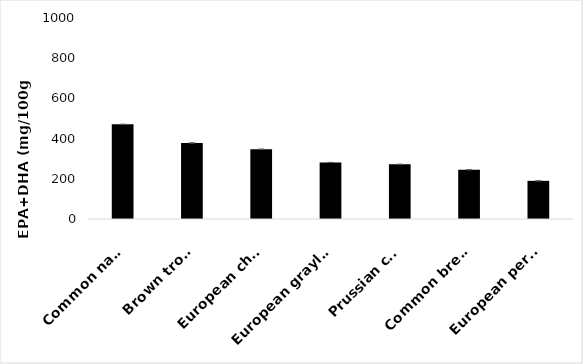
| Category | EPA+DHA |
|---|---|
| Common nase | 471.05 |
| Brown trout | 378.408 |
| European chub | 347.09 |
| European grayling | 281.405 |
| Prussian carp | 272.114 |
| Common bream | 245.07 |
| European perch  | 189.752 |